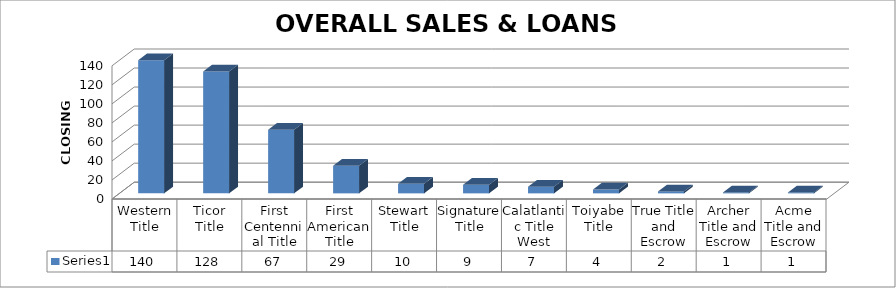
| Category | Series 0 |
|---|---|
| Western Title | 140 |
| Ticor Title | 128 |
| First Centennial Title | 67 |
| First American Title | 29 |
| Stewart Title | 10 |
| Signature Title | 9 |
| Calatlantic Title West | 7 |
| Toiyabe Title | 4 |
| True Title and Escrow | 2 |
| Archer Title and Escrow | 1 |
| Acme Title and Escrow | 1 |